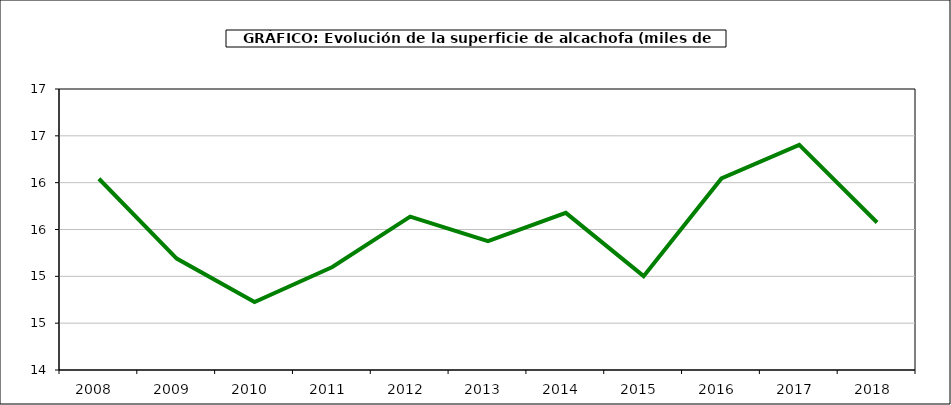
| Category | superficie |
|---|---|
| 2008.0 | 16.042 |
| 2009.0 | 15.19 |
| 2010.0 | 14.726 |
| 2011.0 | 15.1 |
| 2012.0 | 15.638 |
| 2013.0 | 15.376 |
| 2014.0 | 15.678 |
| 2015.0 | 15.002 |
| 2016.0 | 16.045 |
| 2017.0 | 16.403 |
| 2018.0 | 15.575 |